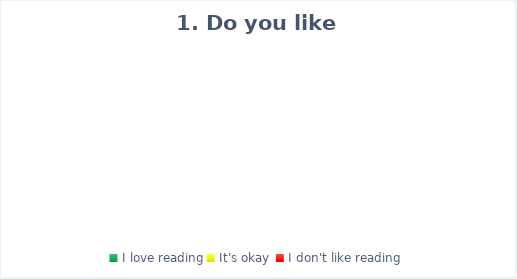
| Category | Series 0 |
|---|---|
| I love reading | 0 |
| It's okay  | 0 |
| I don't like reading | 0 |